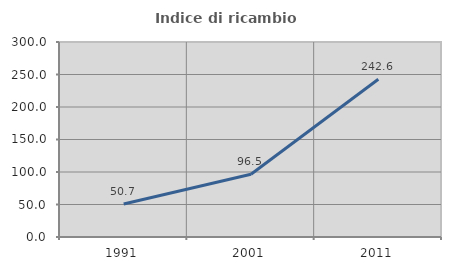
| Category | Indice di ricambio occupazionale  |
|---|---|
| 1991.0 | 50.68 |
| 2001.0 | 96.522 |
| 2011.0 | 242.581 |